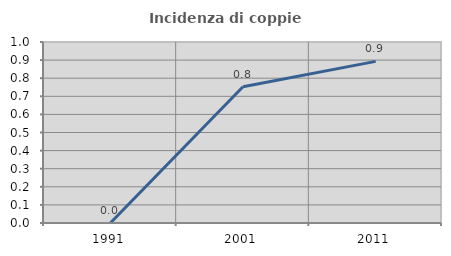
| Category | Incidenza di coppie miste |
|---|---|
| 1991.0 | 0 |
| 2001.0 | 0.753 |
| 2011.0 | 0.893 |